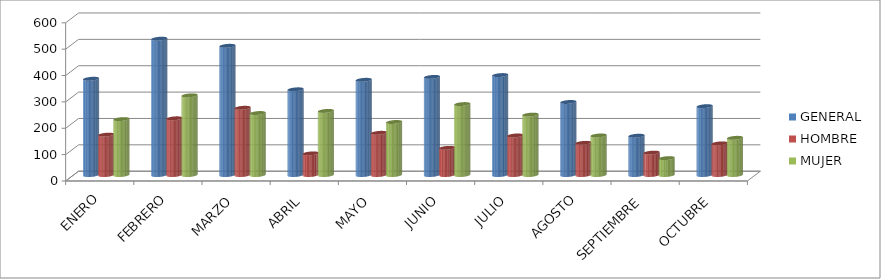
| Category | GENERAL | HOMBRE | MUJER |
|---|---|---|---|
| ENERO | 365 | 153 | 212 |
| FEBRERO | 517 | 215 | 302 |
| MARZO | 490 | 255 | 235 |
| ABRIL | 325 | 82 | 243 |
| MAYO | 361 | 160 | 201 |
| JUNIO | 372 | 103 | 269 |
| JULIO | 379 | 150 | 229 |
| AGOSTO | 277 | 122 | 150 |
| SEPTIEMBRE | 149 | 85 | 64 |
| OCTUBRE | 261 | 120 | 141 |